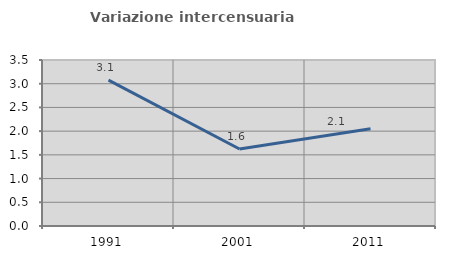
| Category | Variazione intercensuaria annua |
|---|---|
| 1991.0 | 3.077 |
| 2001.0 | 1.623 |
| 2011.0 | 2.052 |